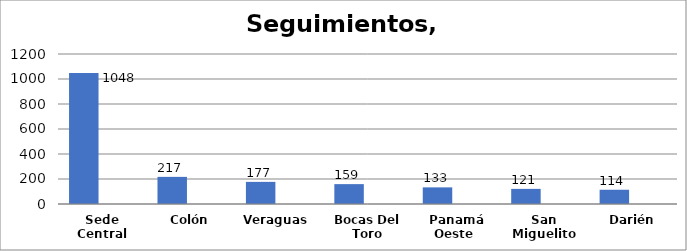
| Category | Series 0 | Series 1 |
|---|---|---|
| Sede Central | 1048 |  |
| Colón | 217 |  |
| Veraguas  | 177 |  |
| Bocas Del Toro | 159 |  |
| Panamá Oeste  | 133 |  |
| San Miguelito | 121 |  |
| Darién | 114 |  |